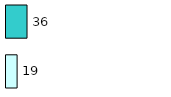
| Category | Series 0 | Series 1 |
|---|---|---|
| 0 | 19 | 36 |